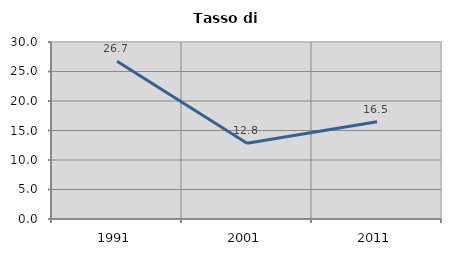
| Category | Tasso di disoccupazione   |
|---|---|
| 1991.0 | 26.744 |
| 2001.0 | 12.846 |
| 2011.0 | 16.479 |